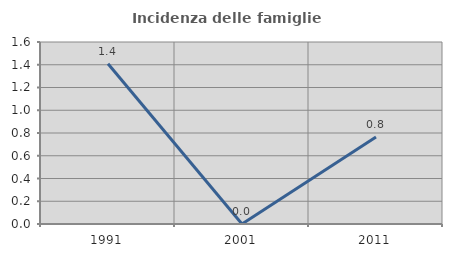
| Category | Incidenza delle famiglie numerose |
|---|---|
| 1991.0 | 1.408 |
| 2001.0 | 0 |
| 2011.0 | 0.765 |